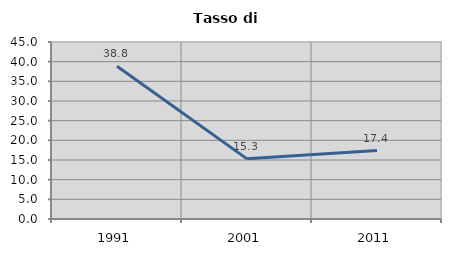
| Category | Tasso di disoccupazione   |
|---|---|
| 1991.0 | 38.834 |
| 2001.0 | 15.293 |
| 2011.0 | 17.406 |